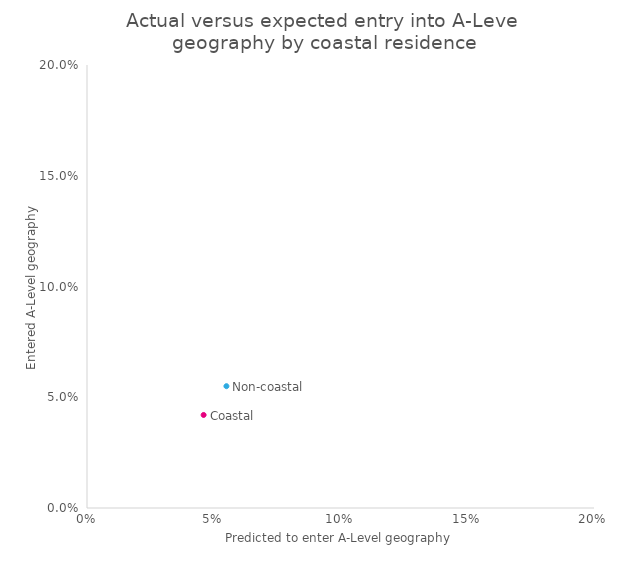
| Category | Series 0 |
|---|---|
| 0.046 | 0.042 |
| 0.055 | 0.055 |